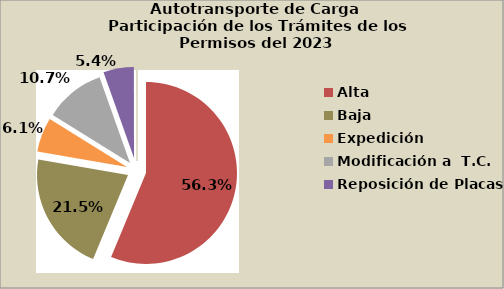
| Category | Series 0 |
|---|---|
| Alta                                         | 56.266 |
| Baja | 21.465 |
| Expedición | 6.129 |
| Modificación a  T.C. | 10.704 |
| Reposición de Placas | 5.415 |
| Otros | 0.022 |